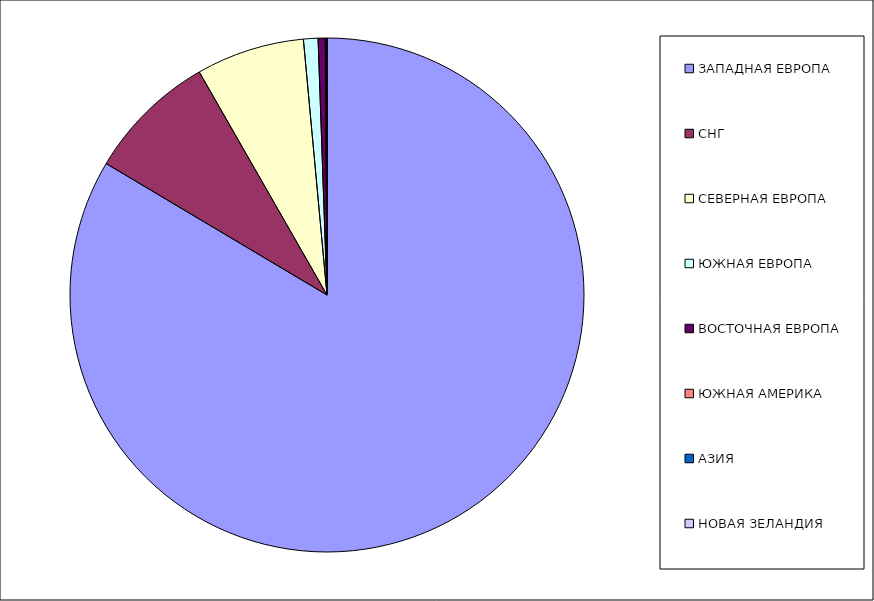
| Category | Оборот |
|---|---|
| ЗАПАДНАЯ ЕВРОПА | 0.835 |
| СНГ | 0.082 |
| СЕВЕРНАЯ ЕВРОПА | 0.068 |
| ЮЖНАЯ ЕВРОПА | 0.009 |
| ВОСТОЧНАЯ ЕВРОПА | 0.005 |
| ЮЖНАЯ АМЕРИКА | 0.001 |
| АЗИЯ | 0 |
| НОВАЯ ЗЕЛАНДИЯ | 0 |